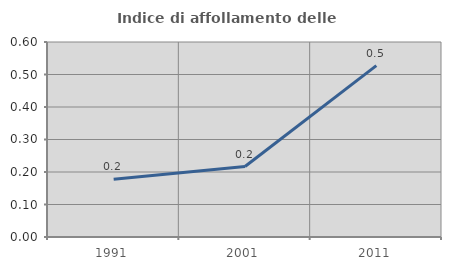
| Category | Indice di affollamento delle abitazioni  |
|---|---|
| 1991.0 | 0.177 |
| 2001.0 | 0.217 |
| 2011.0 | 0.527 |